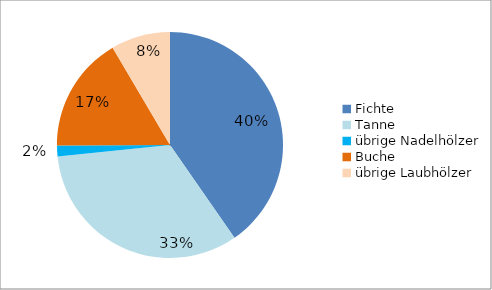
| Category | Series 0 |
|---|---|
| Fichte | 0.403 |
| Tanne | 0.33 |
| übrige Nadelhölzer | 0.015 |
| Buche | 0.166 |
| übrige Laubhölzer | 0.085 |